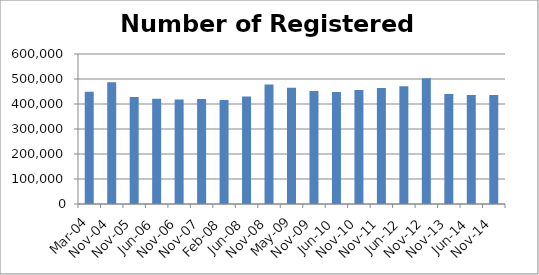
| Category | Number of Registered Voters |
|---|---|
| Mar-04 | 448948 |
| Nov-04 | 486937 |
| Nov-05 | 428481 |
| Jun-06 | 421094 |
| Nov-06 | 418285 |
| Nov-07 | 419598 |
| Feb-08 | 415761 |
| Jun-08 | 430259 |
| Nov-08 | 477651 |
| May-09 | 465428 |
| Nov-09 | 451988 |
| Jun-10 | 448346 |
| Nov-10 | 456179 |
| Nov-11 | 464380 |
| Jun-12 | 470668 |
| Nov-12 | 502841 |
| Nov-13 | 440037 |
| Jun-14 | 435757 |
| Nov-14 | 436019 |